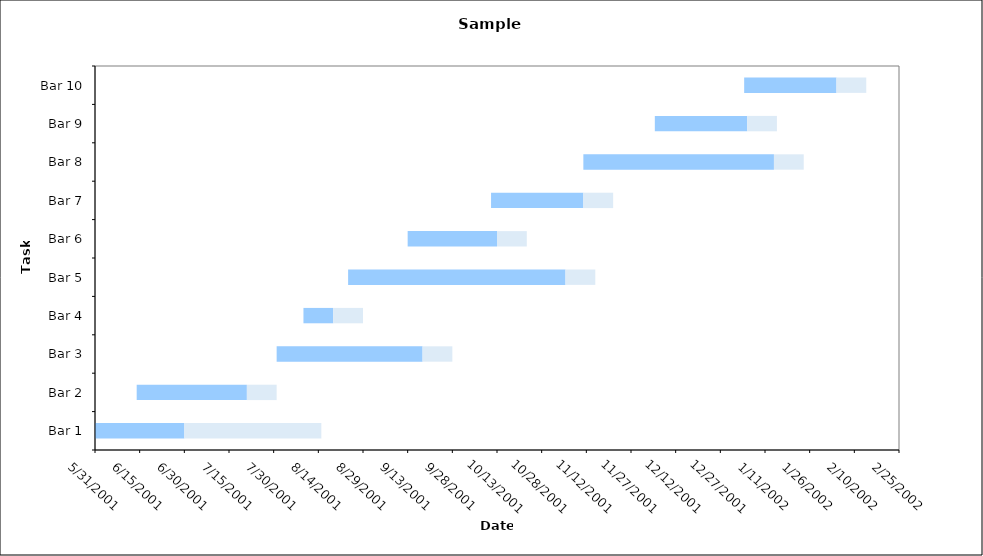
| Category | Date | Bar Length (days) | Bar 2 Length (Days) |
|---|---|---|---|
| Bar 1 | 5/31/01 | 30 | 46 |
| Bar 2 | 6/14/01 | 37 | 10 |
| Bar 3 | 7/31/01 | 49 | 10 |
| Bar 4 | 8/9/01 | 10 | 10 |
| Bar 5 | 8/24/01 | 73 | 10 |
| Bar 6 | 9/13/01 | 30 | 10 |
| Bar 7 | 10/11/01 | 31 | 10 |
| Bar 8 | 11/11/01 | 64 | 10 |
| Bar 9 | 12/5/01 | 31 | 10 |
| Bar 10 | 1/4/02 | 31 | 10 |